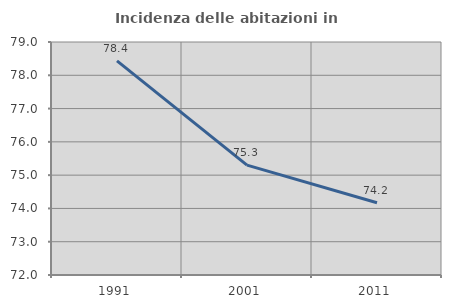
| Category | Incidenza delle abitazioni in proprietà  |
|---|---|
| 1991.0 | 78.434 |
| 2001.0 | 75.299 |
| 2011.0 | 74.171 |